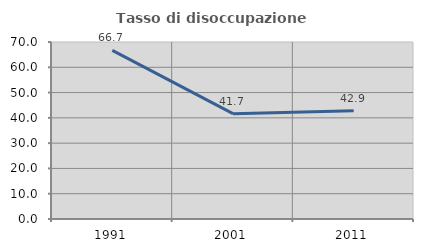
| Category | Tasso di disoccupazione giovanile  |
|---|---|
| 1991.0 | 66.667 |
| 2001.0 | 41.667 |
| 2011.0 | 42.857 |